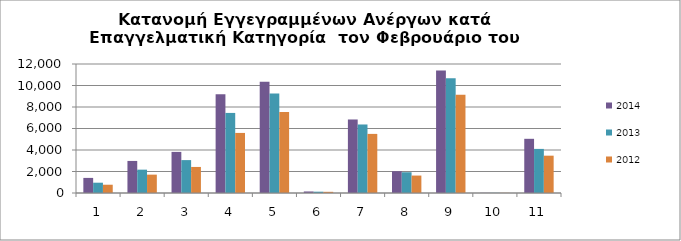
| Category | 2014 | 2013 | 2012 |
|---|---|---|---|
| 1.0 | 1404 | 958 | 770 |
| 2.0 | 2982 | 2171 | 1708 |
| 3.0 | 3824 | 3061 | 2423 |
| 4.0 | 9176 | 7449 | 5588 |
| 5.0 | 10354 | 9256 | 7537 |
| 6.0 | 143 | 122 | 110 |
| 7.0 | 6839 | 6374 | 5498 |
| 8.0 | 2029 | 1932 | 1622 |
| 9.0 | 11396 | 10668 | 9133 |
| 10.0 | 16 | 16 | 13 |
| 11.0 | 5041 | 4102 | 3472 |